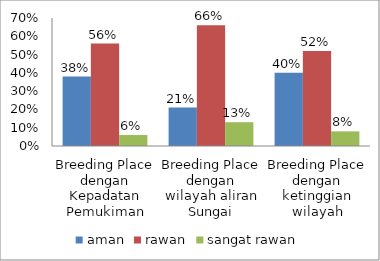
| Category | aman | rawan | sangat rawan |
|---|---|---|---|
| Breeding Place dengan Kepadatan Pemukiman | 0.38 | 0.56 | 0.06 |
| Breeding Place dengan wilayah aliran Sungai | 0.21 | 0.66 | 0.13 |
| Breeding Place dengan ketinggian wilayah | 0.4 | 0.52 | 0.08 |